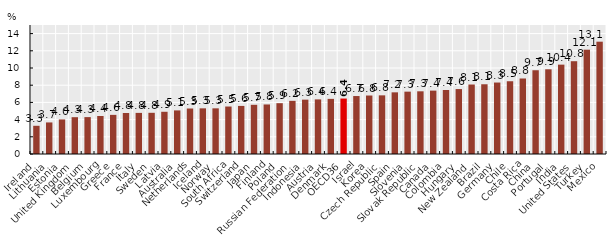
| Category | Series 0 |
|---|---|
| Ireland | 3.28 |
| Lithuania | 3.67 |
| Estonia | 4.02 |
| United Kingdom | 4.28 |
| Belgium | 4.29 |
| Luxembourg | 4.42 |
| Greece | 4.55 |
| France | 4.77 |
| Italy | 4.78 |
| Sweden | 4.79 |
| Latvia | 4.91 |
| Australia | 5.07 |
| Netherlands | 5.29 |
| Iceland | 5.31 |
| Norway | 5.31 |
| South Africa | 5.52 |
| Switzerland | 5.59 |
| Japan | 5.72 |
| Finland | 5.76 |
| Poland | 5.91 |
| Russian Federation | 6.18 |
| Indonesia | 6.32 |
| Austria | 6.35 |
| Denmark | 6.41 |
| OECD36 | 6.449 |
| Israel | 6.74 |
| Korea | 6.8 |
| Czech Republic | 6.82 |
| Spain | 7.17 |
| Slovenia | 7.25 |
| Slovak Republic | 7.29 |
| Canada | 7.37 |
| Colombia | 7.44 |
| Hungary | 7.55 |
| New Zealand | 8.08 |
| Brazil | 8.11 |
| Germany | 8.31 |
| Chile | 8.46 |
| Costa Rica | 8.78 |
| China | 9.74 |
| Portugal | 9.85 |
| India | 10.39 |
| United States | 10.79 |
| Turkey | 12.13 |
| Mexico | 13.06 |